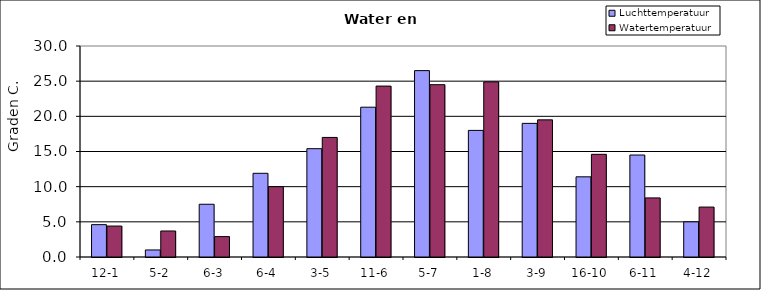
| Category | Luchttemperatuur | Watertemperatuur |
|---|---|---|
| 12-1 | 4.6 | 4.4 |
| 5-2 | 1 | 3.7 |
| 6-3 | 7.5 | 2.9 |
| 6-4 | 11.9 | 10 |
| 3-5 | 15.4 | 17 |
| 11-6 | 21.3 | 24.3 |
| 5-7 | 26.5 | 24.5 |
| 1-8 | 18 | 24.9 |
| 3-9 | 19 | 19.5 |
| 16-10 | 11.4 | 14.6 |
| 6-11 | 14.5 | 8.4 |
| 4-12 | 5 | 7.1 |